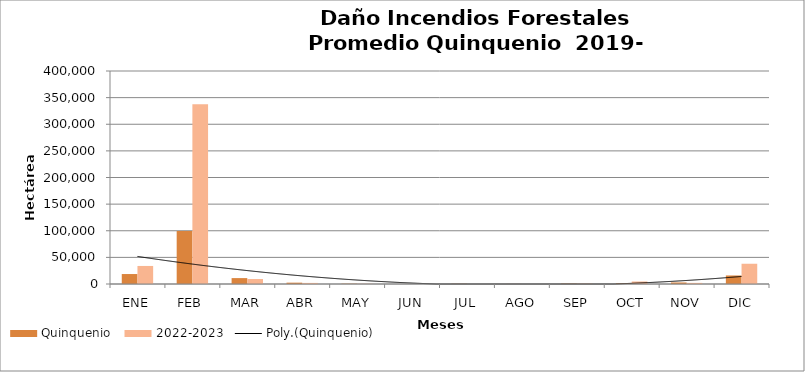
| Category | Quinquenio | 2022-2023 |
|---|---|---|
| ENE | 18726.724 | 33879.62 |
| FEB | 99685.714 | 337498.53 |
| MAR | 11090.582 | 9337.69 |
| ABR | 2520.71 | 2020.59 |
| MAY | 587.846 | 460.16 |
| JUN | 59.241 | 96.66 |
| JUL | 442.703 | 40.75 |
| AGO | 129.77 | 21.22 |
| SEP | 831.281 | 917.64 |
| OCT | 1505.968 | 4725.42 |
| NOV | 2877.056 | 2081.72 |
| DIC | 16025.772 | 38023.02 |